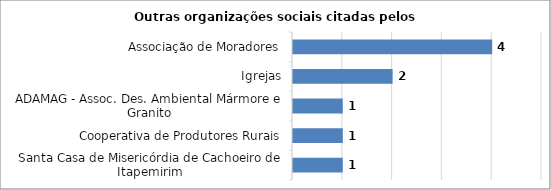
| Category | Series 0 |
|---|---|
| Santa Casa de Misericórdia de Cachoeiro de Itapemirim | 1 |
| Cooperativa de Produtores Rurais | 1 |
| ADAMAG - Assoc. Des. Ambiental Mármore e Granito | 1 |
| Igrejas | 2 |
| Associação de Moradores | 4 |